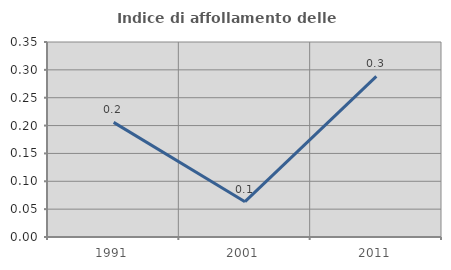
| Category | Indice di affollamento delle abitazioni  |
|---|---|
| 1991.0 | 0.206 |
| 2001.0 | 0.063 |
| 2011.0 | 0.288 |